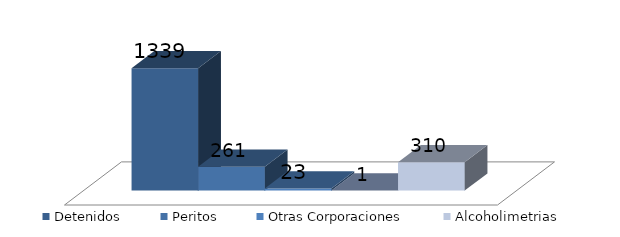
| Category | Detenidos | Peritos | Otras Corporaciones | #REF! | Alcoholimetrias |
|---|---|---|---|---|---|
| 0 | 1339 | 261 | 23 | 1 | 310 |